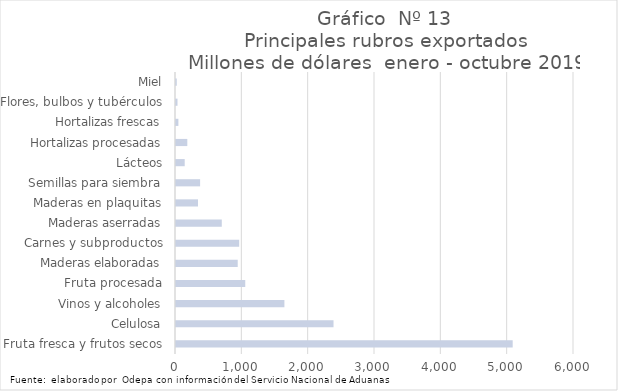
| Category | Series 7 |
|---|---|
| Fruta fresca y frutos secos | 5075592.475 |
| Celulosa | 2374718.593 |
| Vinos y alcoholes | 1634126.983 |
| Fruta procesada | 1043877.102 |
| Maderas elaboradas | 930473.407 |
| Carnes y subproductos | 952294.696 |
| Maderas aserradas | 690286.091 |
| Maderas en plaquitas | 331937.216 |
| Semillas para siembra | 363346.522 |
| Lácteos | 131195.758 |
| Hortalizas procesadas | 170337.485 |
| Hortalizas frescas | 36003.619 |
| Flores, bulbos y tubérculos | 22493.666 |
| Miel | 11540.924 |